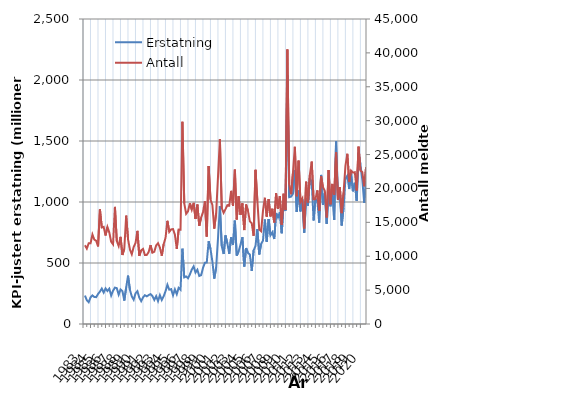
| Category | Erstatning |
|---|---|
| 1983.0 | 232.937 |
| nan | 195.121 |
| nan | 178.438 |
| nan | 218.579 |
| 1984.0 | 234.389 |
| nan | 221.715 |
| nan | 219.826 |
| nan | 245.877 |
| 1985.0 | 265.702 |
| nan | 290.42 |
| nan | 257.346 |
| nan | 291.865 |
| 1986.0 | 270.604 |
| nan | 289.558 |
| nan | 233.055 |
| nan | 272.728 |
| 1987.0 | 297.95 |
| nan | 294.021 |
| nan | 240.61 |
| nan | 283.085 |
| 1988.0 | 269.44 |
| nan | 192.069 |
| nan | 299.153 |
| nan | 396.293 |
| 1989.0 | 279.972 |
| nan | 226.285 |
| nan | 199.112 |
| nan | 251.201 |
| 1990.0 | 268.971 |
| nan | 216.388 |
| nan | 187.666 |
| nan | 218.436 |
| 1991.0 | 235.713 |
| nan | 226.637 |
| nan | 237.191 |
| nan | 245.226 |
| 1992.0 | 229.086 |
| nan | 197.393 |
| nan | 228.083 |
| nan | 188.213 |
| 1993.0 | 236.156 |
| nan | 196.535 |
| nan | 227.061 |
| nan | 268.62 |
| 1994.0 | 321.731 |
| nan | 281.266 |
| nan | 285.763 |
| nan | 235.54 |
| 1995.0 | 283.776 |
| nan | 244.132 |
| nan | 296.645 |
| nan | 281.65 |
| 1996.0 | 617.657 |
| nan | 382.464 |
| nan | 389.296 |
| nan | 375.446 |
| 1997.0 | 406.453 |
| nan | 446.013 |
| nan | 472.333 |
| nan | 421.43 |
| 1998.0 | 444.599 |
| nan | 393.872 |
| nan | 400.307 |
| nan | 460.108 |
| 1999.0 | 501.845 |
| nan | 504.283 |
| nan | 678.577 |
| nan | 614.541 |
| 2000.0 | 512.261 |
| nan | 372.014 |
| nan | 461.192 |
| nan | 703.176 |
| 2001.0 | 965.028 |
| nan | 638.852 |
| nan | 573.774 |
| nan | 725.942 |
| 2002.0 | 661.156 |
| nan | 575.27 |
| nan | 710.935 |
| nan | 647.82 |
| 2003.0 | 847.26 |
| nan | 560.178 |
| nan | 595.958 |
| nan | 649.208 |
| 2004.0 | 712.217 |
| nan | 470.87 |
| nan | 622.509 |
| nan | 581.854 |
| 2005.0 | 569.493 |
| nan | 434.602 |
| nan | 603.345 |
| nan | 639.394 |
| 2006.0 | 777.195 |
| nan | 569.965 |
| nan | 655.815 |
| nan | 684.196 |
| 2007.0 | 856.408 |
| nan | 673.317 |
| nan | 860.276 |
| nan | 727.347 |
| 2008.0 | 752.172 |
| nan | 696.322 |
| nan | 909.437 |
| nan | 873.42 |
| 2009.0 | 916.557 |
| nan | 744.098 |
| nan | 982.934 |
| nan | 929.078 |
| 2010.0 | 2038.021 |
| nan | 1039.492 |
| nan | 1044.493 |
| nan | 1068.56 |
| 2011.0 | 1262.842 |
| nan | 918.31 |
| nan | 1094.943 |
| nan | 922.779 |
| 2012.0 | 1022.313 |
| nan | 747.404 |
| nan | 1030.461 |
| nan | 970.277 |
| 2013.0 | 1191.601 |
| nan | 1166.802 |
| nan | 849.019 |
| nan | 1025.516 |
| 2014.0 | 1011.435 |
| nan | 830.588 |
| nan | 1221.838 |
| nan | 976.933 |
| 2015.0 | 1071.822 |
| nan | 820.828 |
| nan | 1086.542 |
| nan | 964.725 |
| 2016.0 | 1109.027 |
| nan | 853.659 |
| nan | 1497.167 |
| nan | 1015.828 |
| 2017.0 | 1088.954 |
| nan | 807.65 |
| nan | 953.843 |
| nan | 1191.034 |
| 2018.0 | 1215.874 |
| nan | 1106.121 |
| nan | 1232.942 |
| nan | 1087.816 |
| 2019.0 | 1157.146 |
| nan | 1008.947 |
| nan | 1404.229 |
| nan | 1307.73 |
| 2020.0 | 1182.332 |
| nan | 993.156 |
| nan | 1172.187 |